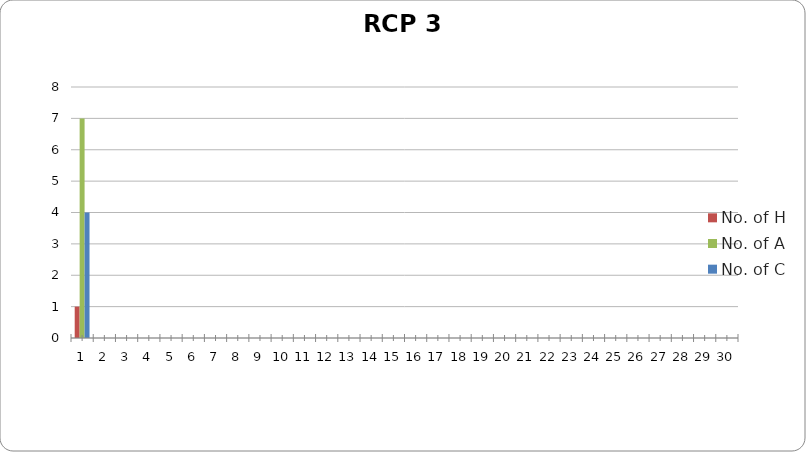
| Category | No. of H | No. of A | No. of C |
|---|---|---|---|
| 0 | 1 | 7 | 4 |
| 1 | 0 | 0 | 0 |
| 2 | 0 | 0 | 0 |
| 3 | 0 | 0 | 0 |
| 4 | 0 | 0 | 0 |
| 5 | 0 | 0 | 0 |
| 6 | 0 | 0 | 0 |
| 7 | 0 | 0 | 0 |
| 8 | 0 | 0 | 0 |
| 9 | 0 | 0 | 0 |
| 10 | 0 | 0 | 0 |
| 11 | 0 | 0 | 0 |
| 12 | 0 | 0 | 0 |
| 13 | 0 | 0 | 0 |
| 14 | 0 | 0 | 0 |
| 15 | 0 | 0 | 0 |
| 16 | 0 | 0 | 0 |
| 17 | 0 | 0 | 0 |
| 18 | 0 | 0 | 0 |
| 19 | 0 | 0 | 0 |
| 20 | 0 | 0 | 0 |
| 21 | 0 | 0 | 0 |
| 22 | 0 | 0 | 0 |
| 23 | 0 | 0 | 0 |
| 24 | 0 | 0 | 0 |
| 25 | 0 | 0 | 0 |
| 26 | 0 | 0 | 0 |
| 27 | 0 | 0 | 0 |
| 28 | 0 | 0 | 0 |
| 29 | 0 | 0 | 0 |